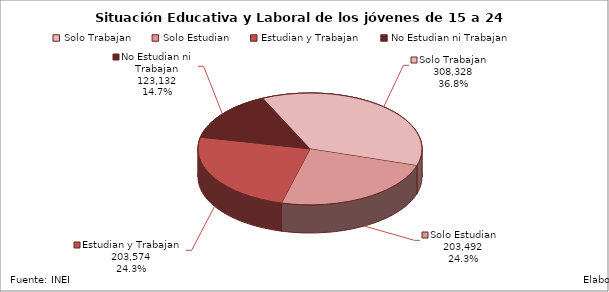
| Category | Series 0 |
|---|---|
| Solo Trabajan | 308328.29 |
| Solo Estudian | 203492.23 |
| Estudian y Trabajan | 203574.41 |
| No Estudian ni Trabajan | 123132.17 |